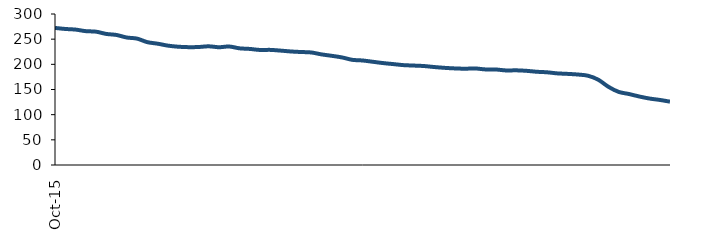
| Category | Series 0 |
|---|---|
| 2015-10-01 | 272.342 |
| 2015-11-01 | 270.271 |
| 2015-12-01 | 269.029 |
| 2016-01-01 | 265.942 |
| 2016-02-01 | 264.894 |
| 2016-03-01 | 260.422 |
| 2016-04-01 | 258.328 |
| 2016-05-01 | 253.283 |
| 2016-06-01 | 251.138 |
| 2016-07-01 | 244.094 |
| 2016-08-01 | 241.049 |
| 2016-09-01 | 237.208 |
| 2016-10-01 | 235.027 |
| 2016-11-01 | 234.148 |
| 2016-12-01 | 234.409 |
| 2017-01-01 | 235.803 |
| 2017-02-01 | 233.971 |
| 2017-03-01 | 235.422 |
| 2017-04-01 | 231.793 |
| 2017-05-01 | 230.616 |
| 2017-06-01 | 228.548 |
| 2017-07-01 | 228.711 |
| 2017-08-01 | 227.276 |
| 2017-09-01 | 225.566 |
| 2017-10-01 | 224.469 |
| 2017-11-01 | 223.579 |
| 2017-12-01 | 219.752 |
| 2018-01-01 | 216.932 |
| 2018-02-01 | 213.718 |
| 2018-03-01 | 208.945 |
| 2018-04-01 | 207.658 |
| 2018-05-01 | 205.111 |
| 2018-06-01 | 202.506 |
| 2018-07-01 | 200.483 |
| 2018-08-01 | 198.424 |
| 2018-09-01 | 197.545 |
| 2018-10-01 | 196.615 |
| 2018-11-01 | 194.641 |
| 2018-12-01 | 193.019 |
| 2019-01-01 | 191.892 |
| 2019-02-01 | 191.304 |
| 2019-03-01 | 191.791 |
| 2019-04-01 | 189.89 |
| 2019-05-01 | 189.762 |
| 2019-06-01 | 187.874 |
| 2019-07-01 | 188.084 |
| 2019-08-01 | 187.109 |
| 2019-09-01 | 185.248 |
| 2019-10-01 | 184.195 |
| 2019-11-01 | 182.028 |
| 2019-12-01 | 181.044 |
| 2020-01-01 | 179.776 |
| 2020-02-01 | 177.328 |
| 2020-03-01 | 169.453 |
| 2020-04-01 | 155.277 |
| 2020-05-01 | 145.207 |
| 2020-06-01 | 141.034 |
| 2020-07-01 | 136.109 |
| 2020-08-01 | 132.034 |
| 2020-09-01 | 129.3 |
| 2020-10-01 | 125.829 |